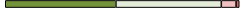
| Category | Series 0 | Series 1 | Series 2 | Series 3 |
|---|---|---|---|---|
| 0 | 105 | 100 | 14 | 3 |